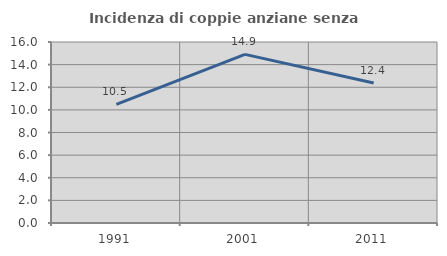
| Category | Incidenza di coppie anziane senza figli  |
|---|---|
| 1991.0 | 10.484 |
| 2001.0 | 14.908 |
| 2011.0 | 12.379 |